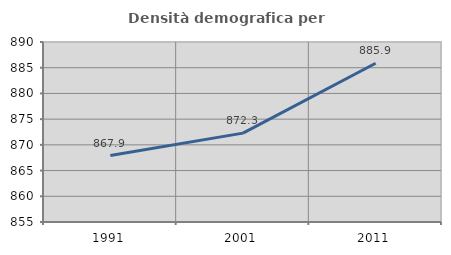
| Category | Densità demografica |
|---|---|
| 1991.0 | 867.916 |
| 2001.0 | 872.278 |
| 2011.0 | 885.871 |